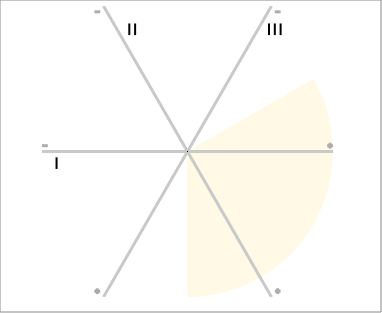
| Category | szög |
|---|---|
| 0 | 1 |
| 1 | 1 |
| 2 | 1 |